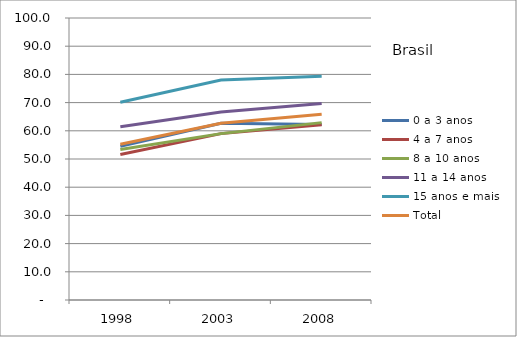
| Category | 0 a 3 anos | 4 a 7 anos | 8 a 10 anos | 11 a 14 anos | 15 anos e mais | Total |
|---|---|---|---|---|---|---|
| 1998 | 54.5 | 51.6 | 53.4 | 61.4 | 70.1 | 55.2 |
| 2003 | 62.7 | 59 | 59 | 66.7 | 78 | 62.7 |
| 2008 | 62.2 | 62.1 | 62.9 | 69.7 | 79.3 | 65.9 |